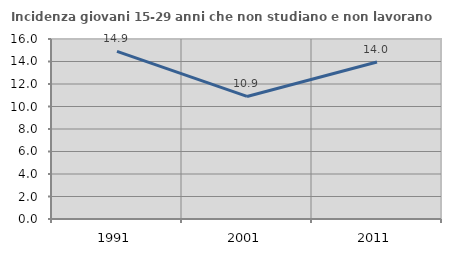
| Category | Incidenza giovani 15-29 anni che non studiano e non lavorano  |
|---|---|
| 1991.0 | 14.9 |
| 2001.0 | 10.895 |
| 2011.0 | 13.957 |